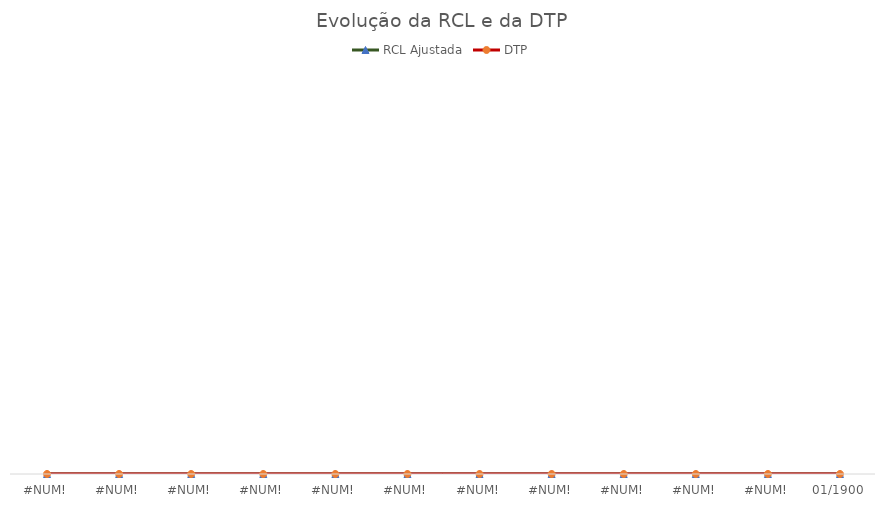
| Category | RCL Ajustada | DTP |
|---|---|---|
| 0.0 | 0 | 0 |
| 0.0 | 0 | 0 |
| 0.0 | 0 | 0 |
| 0.0 | 0 | 0 |
| 0.0 | 0 | 0 |
| 0.0 | 0 | 0 |
| 0.0 | 0 | 0 |
| 0.0 | 0 | 0 |
| 0.0 | 0 | 0 |
| 0.0 | 0 | 0 |
| 0.0 | 0 | 0 |
| 0.0 | 0 | 0 |